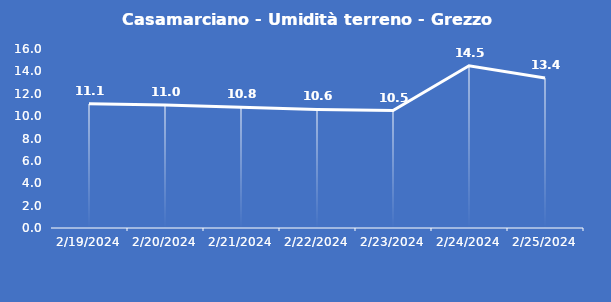
| Category | Casamarciano - Umidità terreno - Grezzo (%VWC) |
|---|---|
| 2/19/24 | 11.1 |
| 2/20/24 | 11 |
| 2/21/24 | 10.8 |
| 2/22/24 | 10.6 |
| 2/23/24 | 10.5 |
| 2/24/24 | 14.5 |
| 2/25/24 | 13.4 |